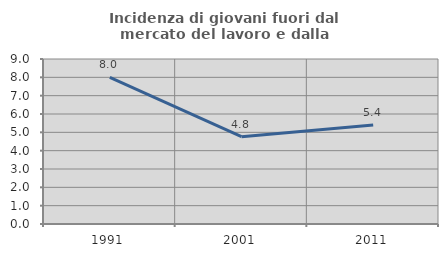
| Category | Incidenza di giovani fuori dal mercato del lavoro e dalla formazione  |
|---|---|
| 1991.0 | 8 |
| 2001.0 | 4.762 |
| 2011.0 | 5.405 |